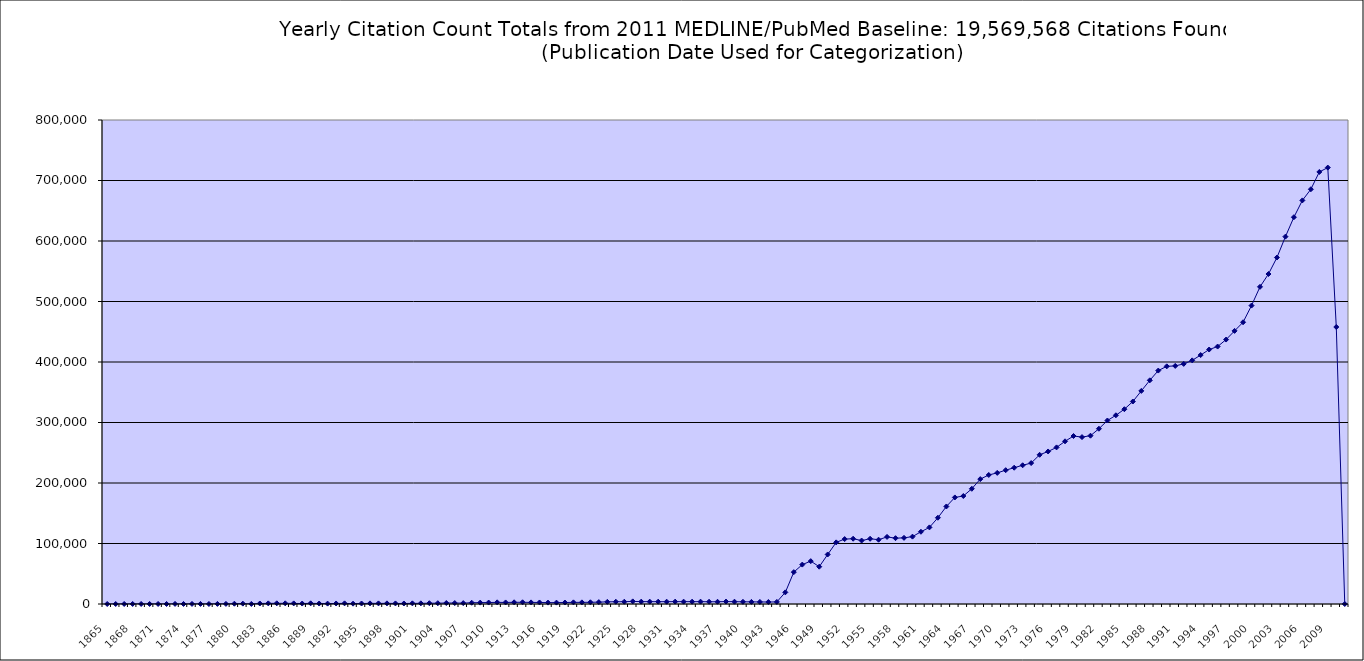
| Category | Series 0 |
|---|---|
| 1865.0 | 3 |
| 1866.0 | 11 |
| 1867.0 | 36 |
| 1868.0 | 95 |
| 1869.0 | 58 |
| 1870.0 | 69 |
| 1871.0 | 62 |
| 1872.0 | 38 |
| 1873.0 | 145 |
| 1874.0 | 39 |
| 1875.0 | 117 |
| 1876.0 | 116 |
| 1877.0 | 46 |
| 1878.0 | 158 |
| 1879.0 | 164 |
| 1880.0 | 473 |
| 1881.0 | 611 |
| 1882.0 | 119 |
| 1883.0 | 828 |
| 1884.0 | 1042 |
| 1885.0 | 1137 |
| 1886.0 | 1117 |
| 1887.0 | 990 |
| 1888.0 | 744 |
| 1889.0 | 1130 |
| 1890.0 | 750 |
| 1891.0 | 624 |
| 1892.0 | 871 |
| 1893.0 | 1074 |
| 1894.0 | 534 |
| 1895.0 | 808 |
| 1896.0 | 1046 |
| 1897.0 | 1000 |
| 1898.0 | 1082 |
| 1899.0 | 950 |
| 1900.0 | 852 |
| 1901.0 | 1055 |
| 1902.0 | 1109 |
| 1903.0 | 1298 |
| 1904.0 | 1329 |
| 1905.0 | 1623 |
| 1906.0 | 1587 |
| 1907.0 | 1449 |
| 1908.0 | 2090 |
| 1909.0 | 2274 |
| 1910.0 | 2388 |
| 1911.0 | 2725 |
| 1912.0 | 2562 |
| 1913.0 | 2797 |
| 1914.0 | 2825 |
| 1915.0 | 2635 |
| 1916.0 | 2528 |
| 1917.0 | 2288 |
| 1918.0 | 2292 |
| 1919.0 | 2432 |
| 1920.0 | 2724 |
| 1921.0 | 2705 |
| 1922.0 | 2832 |
| 1923.0 | 3089 |
| 1924.0 | 3513 |
| 1925.0 | 3736 |
| 1926.0 | 3762 |
| 1927.0 | 4330 |
| 1928.0 | 3884 |
| 1929.0 | 3873 |
| 1930.0 | 3798 |
| 1931.0 | 3814 |
| 1932.0 | 3906 |
| 1933.0 | 3896 |
| 1934.0 | 3848 |
| 1935.0 | 3861 |
| 1936.0 | 3672 |
| 1937.0 | 3678 |
| 1938.0 | 4033 |
| 1939.0 | 3789 |
| 1940.0 | 3623 |
| 1941.0 | 3478 |
| 1942.0 | 3407 |
| 1943.0 | 3259 |
| 1944.0 | 3449 |
| 1945.0 | 19260 |
| 1946.0 | 52651 |
| 1947.0 | 65126 |
| 1948.0 | 70829 |
| 1949.0 | 61657 |
| 1950.0 | 81872 |
| 1951.0 | 101880 |
| 1952.0 | 107308 |
| 1953.0 | 107901 |
| 1954.0 | 104876 |
| 1955.0 | 107817 |
| 1956.0 | 106289 |
| 1957.0 | 110892 |
| 1958.0 | 108785 |
| 1959.0 | 109339 |
| 1960.0 | 111338 |
| 1961.0 | 119403 |
| 1962.0 | 126624 |
| 1963.0 | 142578 |
| 1964.0 | 161191 |
| 1965.0 | 176146 |
| 1966.0 | 178512 |
| 1967.0 | 190468 |
| 1968.0 | 206450 |
| 1969.0 | 213258 |
| 1970.0 | 216722 |
| 1971.0 | 221201 |
| 1972.0 | 225259 |
| 1973.0 | 229289 |
| 1974.0 | 232941 |
| 1975.0 | 246610 |
| 1976.0 | 252105 |
| 1977.0 | 258842 |
| 1978.0 | 268924 |
| 1979.0 | 277664 |
| 1980.0 | 275897 |
| 1981.0 | 278162 |
| 1982.0 | 289696 |
| 1983.0 | 303291 |
| 1984.0 | 311918 |
| 1985.0 | 321986 |
| 1986.0 | 334694 |
| 1987.0 | 352242 |
| 1988.0 | 369713 |
| 1989.0 | 385839 |
| 1990.0 | 392842 |
| 1991.0 | 393528 |
| 1992.0 | 396889 |
| 1993.0 | 402687 |
| 1994.0 | 411465 |
| 1995.0 | 420594 |
| 1996.0 | 425539 |
| 1997.0 | 437111 |
| 1998.0 | 451445 |
| 1999.0 | 465683 |
| 2000.0 | 493284 |
| 2001.0 | 524228 |
| 2002.0 | 545447 |
| 2003.0 | 572697 |
| 2004.0 | 607191 |
| 2005.0 | 639346 |
| 2006.0 | 667113 |
| 2007.0 | 685514 |
| 2008.0 | 714135 |
| 2009.0 | 721372 |
| 2010.0 | 457829 |
| 2011.0 | 0 |